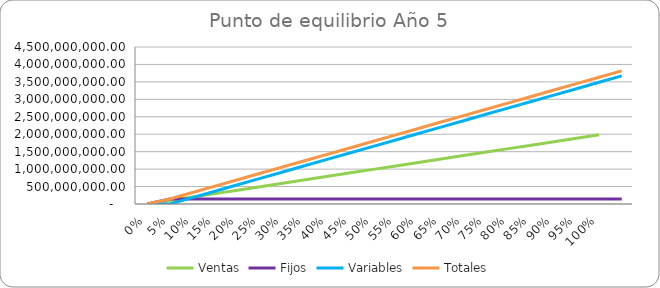
| Category | Ventas | Fijos | Variables | Totales |
|---|---|---|---|---|
| 0.0 | 0 | 0 | 0 | 0 |
| 0.05 | 99225000 | 145047288.086 | 0 | 145047288.086 |
| 0.1 | 198450000 | 145047288.086 | 183613309.273 | 328660597.359 |
| 0.15 | 297675000 | 145047288.086 | 367226618.546 | 512273906.633 |
| 0.2 | 396900000 | 145047288.086 | 550839927.819 | 695887215.906 |
| 0.25 | 496125000 | 145047288.086 | 734453237.093 | 879500525.179 |
| 0.3 | 595350000 | 145047288.086 | 918066546.366 | 1063113834.452 |
| 0.35 | 694575000 | 145047288.086 | 1101679855.639 | 1246727143.725 |
| 0.4 | 793800000 | 145047288.086 | 1285293164.912 | 1430340452.998 |
| 0.45 | 893025000 | 145047288.086 | 1468906474.185 | 1613953762.272 |
| 0.5 | 992250000 | 145047288.086 | 1652519783.458 | 1797567071.545 |
| 0.55 | 1091475000 | 145047288.086 | 1836133092.732 | 1981180380.818 |
| 0.6 | 1190700000 | 145047288.086 | 2019746402.005 | 2164793690.091 |
| 0.65 | 1289925000 | 145047288.086 | 2203359711.278 | 2348406999.364 |
| 0.7 | 1389150000 | 145047288.086 | 2386973020.551 | 2532020308.637 |
| 0.75 | 1488375000 | 145047288.086 | 2570586329.824 | 2715633617.91 |
| 0.8 | 1587600000 | 145047288.086 | 2754199639.097 | 2899246927.184 |
| 0.85 | 1686825000 | 145047288.086 | 2937812948.37 | 3082860236.457 |
| 0.9 | 1786050000 | 145047288.086 | 3121426257.644 | 3266473545.73 |
| 0.95 | 1885275000 | 145047288.086 | 3305039566.917 | 3450086855.003 |
| 1.0 | 1984500000 | 145047288.086 | 3488652876.19 | 3633700164.276 |